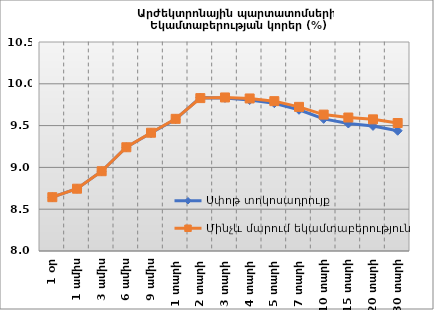
| Category | Սփոթ տոկոսադրույք | Մինչև մարում եկամտաբերություն |
|---|---|---|
| 1 օր | 8.644 | 8.644 |
| 1 ամիս | 8.745 | 8.745 |
| 3 ամիս | 8.954 | 8.954 |
| 6 ամիս | 9.241 | 9.241 |
| 9 ամիս | 9.411 | 9.415 |
| 1 տարի | 9.577 | 9.581 |
| 2 տարի | 9.835 | 9.829 |
| 3 տարի | 9.831 | 9.837 |
| 4 տարի | 9.806 | 9.825 |
| 5 տարի | 9.768 | 9.792 |
| 7 տարի | 9.689 | 9.724 |
| 10 տարի | 9.58 | 9.632 |
| 15 տարի | 9.525 | 9.597 |
| 20 տարի | 9.496 | 9.575 |
| 30 տարի | 9.438 | 9.531 |